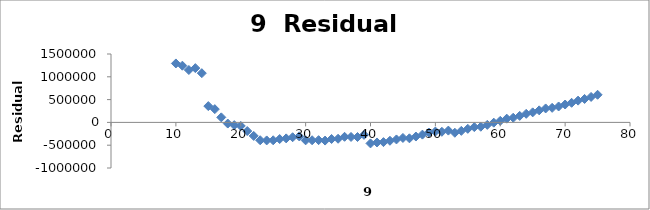
| Category | Series 0 |
|---|---|
| 10.0 | 1292736.441 |
| 11.0 | 1243518.892 |
| 12.0 | 1148838.342 |
| 13.0 | 1190000.792 |
| 14.0 | 1079871.243 |
| 15.0 | 357343.693 |
| 16.0 | 290939.143 |
| 17.0 | 110663.593 |
| 18.0 | -25167.956 |
| 19.0 | -59586.506 |
| 20.0 | -77700.056 |
| 21.0 | -189660.605 |
| 22.0 | -296564.155 |
| 23.0 | -391763.705 |
| 24.0 | -395558.255 |
| 25.0 | -392332.804 |
| 26.0 | -365343.354 |
| 27.0 | -350529.904 |
| 28.0 | -325128.453 |
| 29.0 | -305996.003 |
| 30.0 | -393766.553 |
| 31.0 | -391784.103 |
| 32.0 | -389331.652 |
| 33.0 | -398462.202 |
| 34.0 | -363591.752 |
| 35.0 | -358568.301 |
| 36.0 | -315727.851 |
| 37.0 | -319188.401 |
| 38.0 | -320535.951 |
| 39.0 | -273430.5 |
| 40.0 | -460980.05 |
| 41.0 | -439945.6 |
| 42.0 | -432451.149 |
| 43.0 | -402990.699 |
| 44.0 | -373944.249 |
| 45.0 | -341043.799 |
| 46.0 | -348996.348 |
| 47.0 | -310185.898 |
| 48.0 | -268356.448 |
| 49.0 | -221741.997 |
| 50.0 | -200138.547 |
| 51.0 | -206283.097 |
| 52.0 | -179824.647 |
| 53.0 | -227233.196 |
| 54.0 | -185628.746 |
| 55.0 | -141217.296 |
| 56.0 | -102690.845 |
| 57.0 | -95271.395 |
| 58.0 | -54558.945 |
| 59.0 | -6216.495 |
| 60.0 | 34325.956 |
| 61.0 | 81475.406 |
| 62.0 | 101671.856 |
| 63.0 | 142450.307 |
| 64.0 | 188262.757 |
| 65.0 | 220405.207 |
| 66.0 | 264325.658 |
| 67.0 | 306151.108 |
| 68.0 | 319313.558 |
| 69.0 | 349205.008 |
| 70.0 | 392219.459 |
| 71.0 | 429591.909 |
| 72.0 | 477263.359 |
| 73.0 | 514477.81 |
| 74.0 | 558484.26 |
| 75.0 | 605882.71 |